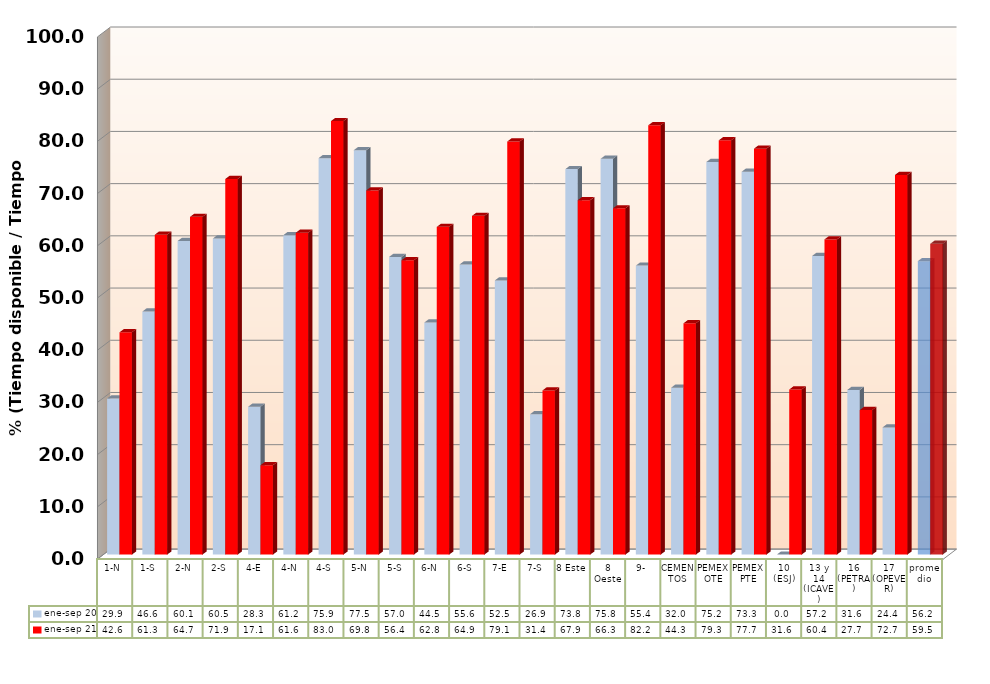
| Category | ene-sep 20 | ene-sep 21 |
|---|---|---|
| 1-N | 29.894 | 42.573 |
| 1-S | 46.555 | 61.269 |
| 2-N | 60.063 | 64.687 |
| 2-S | 60.54 | 71.938 |
| 4-E | 28.317 | 17.124 |
| 4-N | 61.185 | 61.641 |
| 4-S | 75.933 | 83.032 |
| 5-N | 77.468 | 69.759 |
| 5-S | 57.012 | 56.362 |
| 6-N | 44.45 | 62.771 |
| 6-S | 55.573 | 64.879 |
| 7-E | 52.51 | 79.119 |
| 7-S | 26.898 | 31.445 |
| 8 Este | 73.834 | 67.891 |
| 8 Oeste | 75.808 | 66.321 |
| 9- | 55.35 | 82.221 |
| CEMENTOS | 31.96 | 44.302 |
| PEMEX OTE | 75.193 | 79.346 |
| PEMEX PTE | 73.321 | 77.749 |
| 10 (ESJ) | 0 | 31.625 |
| 13 y 14 (ICAVE) | 57.196 | 60.369 |
| 16 (PETRA) | 31.551 | 27.686 |
| 17 (OPEVER) | 24.361 | 72.721 |
| promedio | 56.204 | 59.524 |